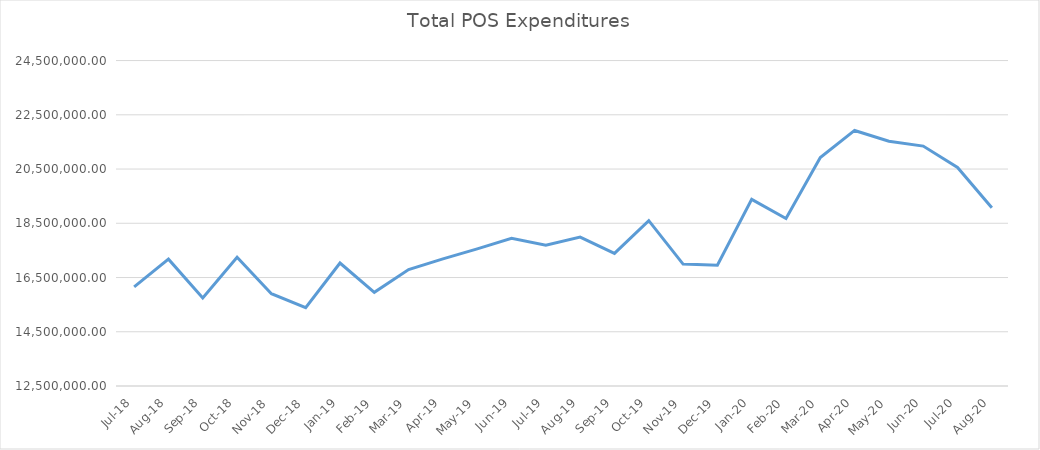
| Category | Total POS Expenditures |
|---|---|
| Jul-18 | 16152156.84 |
| Aug-18 | 17177129.1 |
| Sep-18 | 15743878.31 |
| Oct-18 | 17248580.09 |
| Nov-18 | 15903216.04 |
| Dec-18 | 15384852.81 |
| Jan-19 | 17034730.05 |
| Feb-19 | 15955442.61 |
| Mar-19 | 16791910.44 |
| Apr-19 | 17187793.76 |
| May-19 | 17557794.61 |
| Jun-19 | 17943448.78 |
| Jul-19 | 17692642.99 |
| Aug-19 | 17991920.2 |
| Sep-19 | 17387980.77 |
| Oct-19 | 18596268.43 |
| Nov-19 | 16994508.01 |
| Dec-19 | 16953417.73 |
| Jan-20 | 19381369.52 |
| Feb-20 | 18673674.73 |
| Mar-20 | 20924233.94 |
| Apr-20 | 21923044.92 |
| May-20 | 21523678.49 |
| Jun-20 | 21346916.59 |
| Jul-20 | 20558883.33 |
| Aug-20 | 19074045.4 |